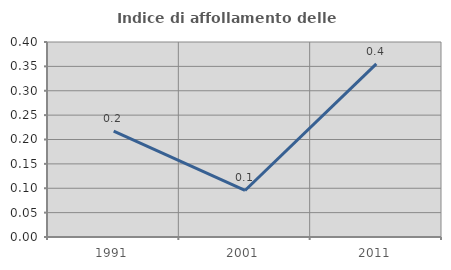
| Category | Indice di affollamento delle abitazioni  |
|---|---|
| 1991.0 | 0.217 |
| 2001.0 | 0.095 |
| 2011.0 | 0.355 |